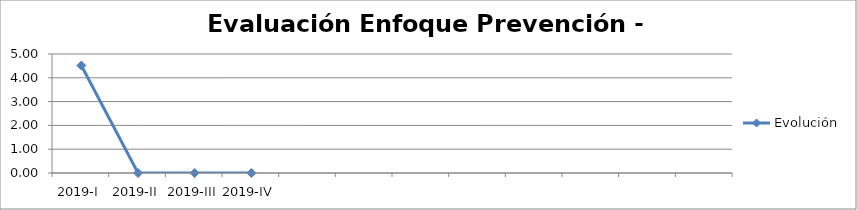
| Category | Evolución |
|---|---|
| 2019-I | 4.517 |
| 2019-II | 0 |
| 2019-III | 0 |
| 2019-IV | 0 |